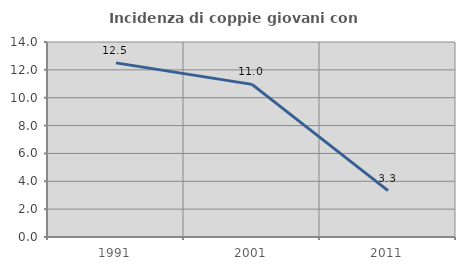
| Category | Incidenza di coppie giovani con figli |
|---|---|
| 1991.0 | 12.5 |
| 2001.0 | 10.959 |
| 2011.0 | 3.333 |